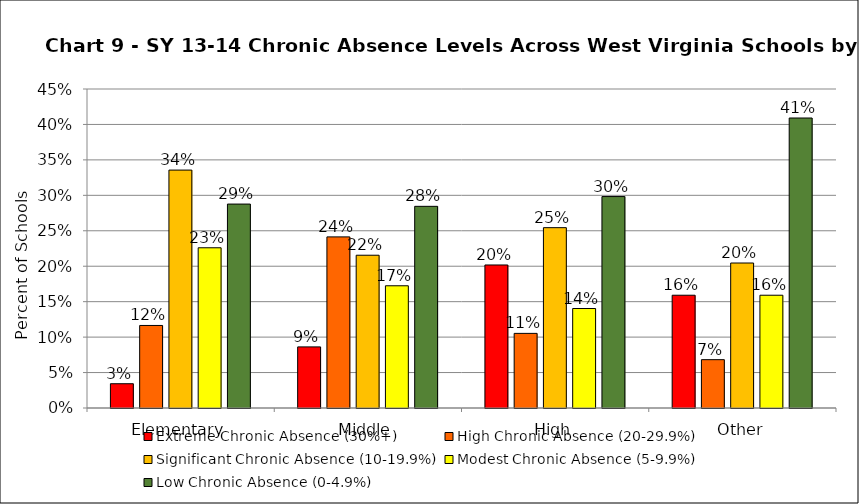
| Category | Extreme Chronic Absence (30%+) | High Chronic Absence (20-29.9%) | Significant Chronic Absence (10-19.9%) | Modest Chronic Absence (5-9.9%) | Low Chronic Absence (0-4.9%) |
|---|---|---|---|---|---|
| 0 | 0.034 | 0.116 | 0.336 | 0.226 | 0.288 |
| 1 | 0.086 | 0.241 | 0.216 | 0.172 | 0.284 |
| 2 | 0.202 | 0.105 | 0.254 | 0.14 | 0.298 |
| 3 | 0.159 | 0.068 | 0.205 | 0.159 | 0.409 |